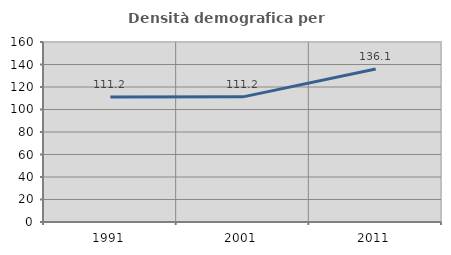
| Category | Densità demografica |
|---|---|
| 1991.0 | 111.152 |
| 2001.0 | 111.223 |
| 2011.0 | 136.065 |